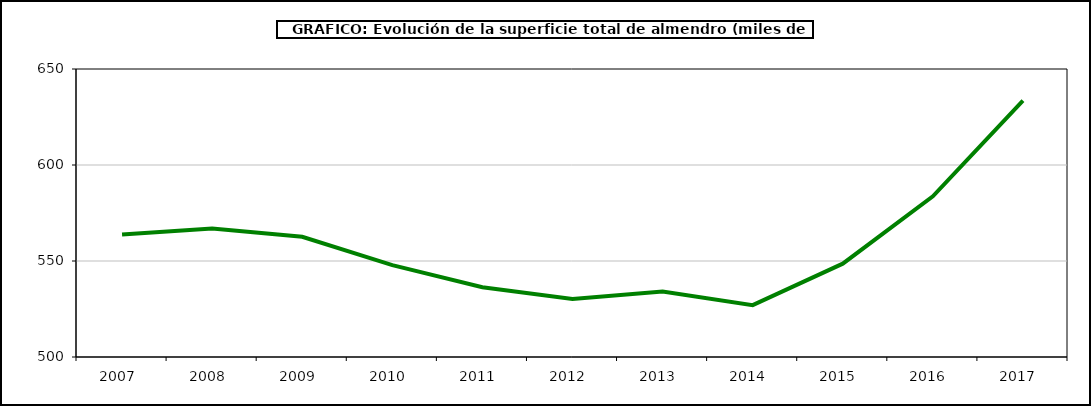
| Category | superficie almendro |
|---|---|
| 2007.0 | 563.77 |
| 2008.0 | 566.869 |
| 2009.0 | 562.616 |
| 2010.0 | 547.822 |
| 2011.0 | 536.312 |
| 2012.0 | 530.223 |
| 2013.0 | 534.057 |
| 2014.0 | 527.029 |
| 2015.0 | 548.604 |
| 2016.0 | 583.673 |
| 2017.0 | 633.562 |